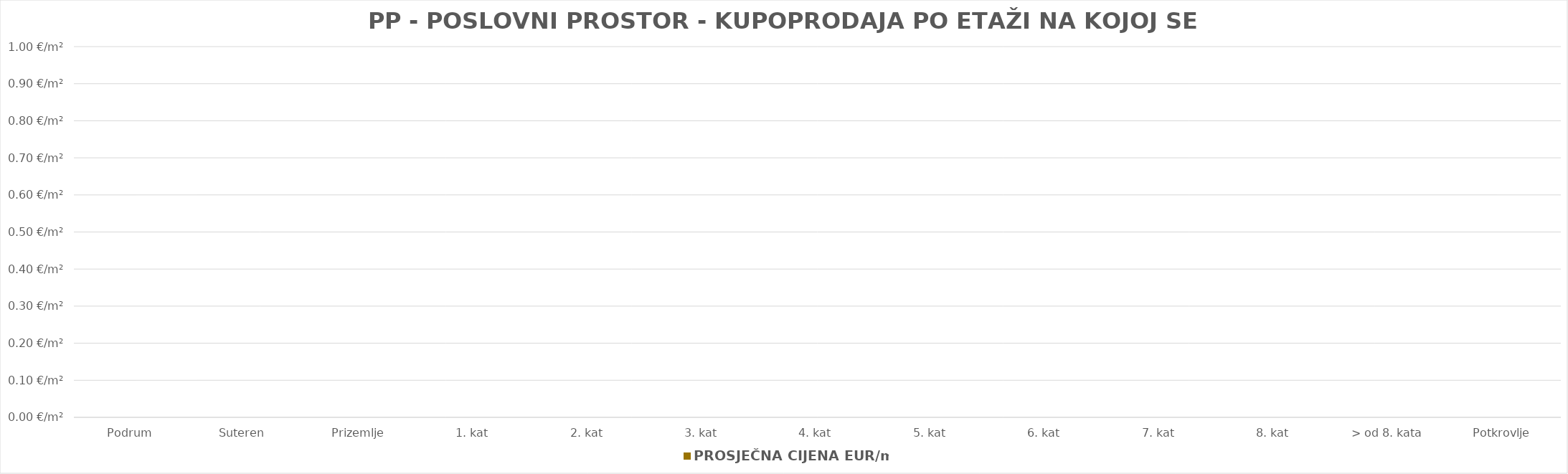
| Category | PROSJEČNA CIJENA EUR/m2 |
|---|---|
| Podrum | 0 |
| Suteren  | 0 |
| Prizemlje | 0 |
| 1. kat | 0 |
| 2. kat | 0 |
| 3. kat | 0 |
| 4. kat | 0 |
| 5. kat | 0 |
| 6. kat | 0 |
| 7. kat | 0 |
| 8. kat | 0 |
| > od 8. kata | 0 |
| Potkrovlje | 0 |